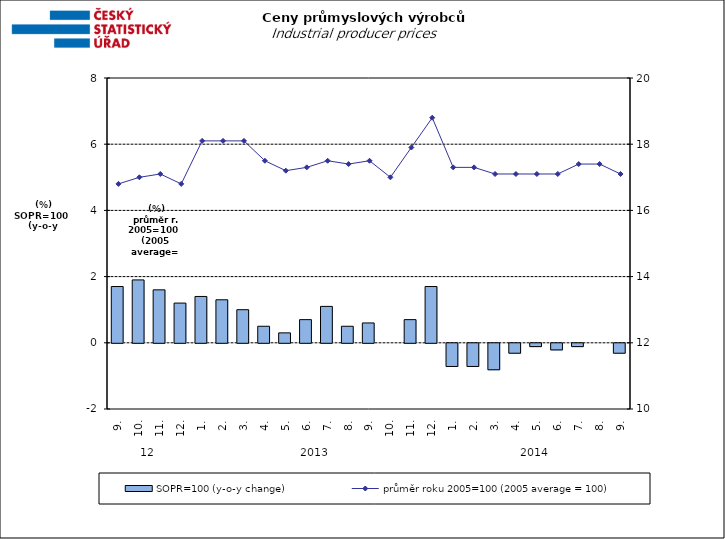
| Category | SOPR=100 (y-o-y change)   |
|---|---|
| 0 | 1.7 |
| 1 | 1.9 |
| 2 | 1.6 |
| 3 | 1.2 |
| 4 | 1.4 |
| 5 | 1.3 |
| 6 | 1 |
| 7 | 0.5 |
| 8 | 0.3 |
| 9 | 0.7 |
| 10 | 1.1 |
| 11 | 0.5 |
| 12 | 0.6 |
| 13 | 0 |
| 14 | 0.7 |
| 15 | 1.7 |
| 16 | -0.7 |
| 17 | -0.7 |
| 18 | -0.8 |
| 19 | -0.3 |
| 20 | -0.1 |
| 21 | -0.2 |
| 22 | -0.1 |
| 23 | 0 |
| 24 | -0.3 |